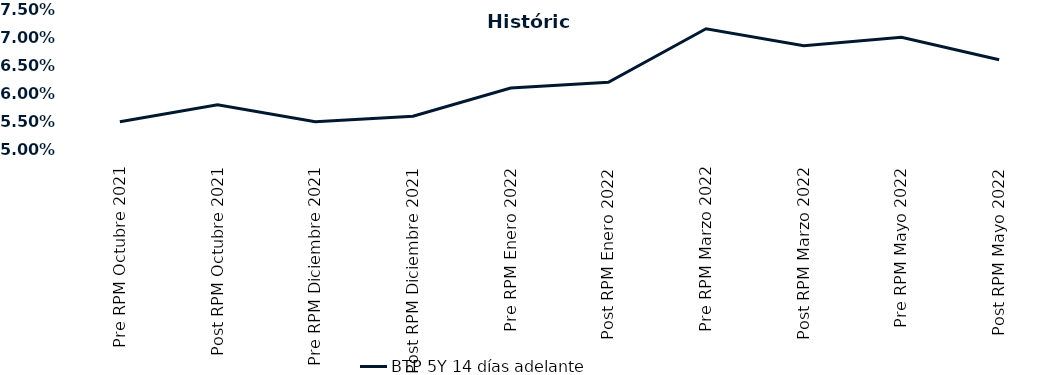
| Category | BTP 5Y 14 días adelante |
|---|---|
| Pre RPM Octubre 2021 | 0.055 |
| Post RPM Octubre 2021 | 0.058 |
| Pre RPM Diciembre 2021 | 0.055 |
| Post RPM Diciembre 2021 | 0.056 |
| Pre RPM Enero 2022 | 0.061 |
| Post RPM Enero 2022 | 0.062 |
| Pre RPM Marzo 2022 | 0.072 |
| Post RPM Marzo 2022 | 0.068 |
| Pre RPM Mayo 2022 | 0.07 |
| Post RPM Mayo 2022 | 0.066 |